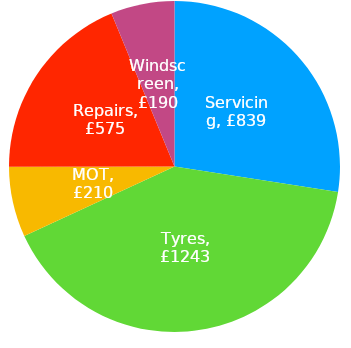
| Category | Total |
|---|---|
| Servicing | 838.96 |
| Tyres | 1242.58 |
| MOT | 209.55 |
| Repairs | 574.99 |
| Windscreen | 190 |